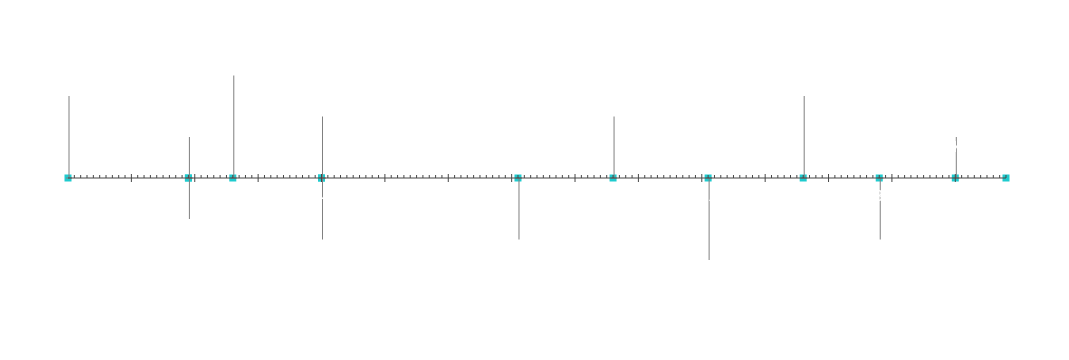
| Category | Позиция |
|---|---|
| Начало на проекта | 20 |
| Контролна точка 1 | 10 |
| Контролна точка 2 | -10 |
| Контролна точка 3 | 25 |
| Контролна точка 4 | -15 |
| Контролна точка 5 | 15 |
| Контролна точка 6 | -15 |
| Контролна точка 7 | 15 |
| Контролна точка 8 | -20 |
| Контролна точка 9 | 20 |
| Контролна точка 10 | -15 |
| Контролна точка 11 | 10 |
| Край на проекта | 5 |